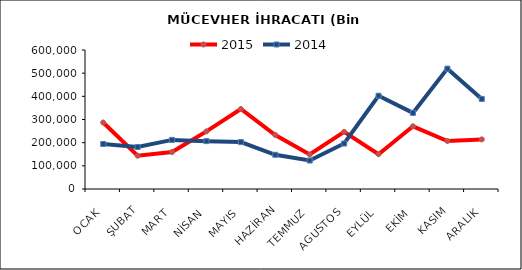
| Category | 2015 | 2014 |
|---|---|---|
| OCAK | 286982.087 | 194304.878 |
| ŞUBAT | 143560.631 | 181236.575 |
| MART | 159554.73 | 211926.394 |
| NİSAN | 248776.813 | 206593.234 |
| MAYIS | 345339.918 | 202434.682 |
| HAZİRAN | 233108.713 | 147653.791 |
| TEMMUZ | 149065.325 | 122825.197 |
| AGUSTOS | 246432.37 | 196259.648 |
| EYLÜL | 150051.198 | 402554.605 |
| EKİM | 270699.334 | 328614.365 |
| KASIM | 207082.898 | 519561.152 |
| ARALIK | 214138.953 | 388890.516 |